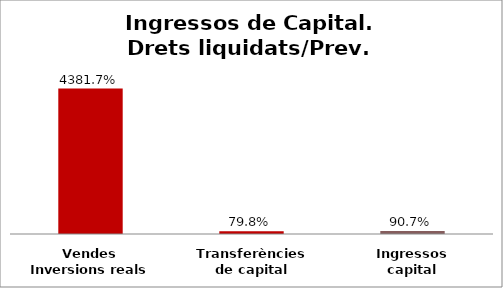
| Category | Series 0 |
|---|---|
| Vendes Inversions reals | 43.817 |
| Transferències de capital | 0.798 |
| Ingressos capital | 0.907 |